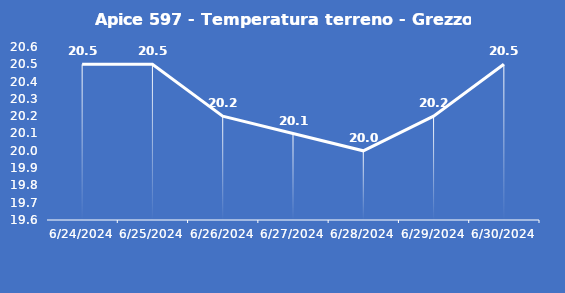
| Category | Apice 597 - Temperatura terreno - Grezzo (°C) |
|---|---|
| 6/24/24 | 20.5 |
| 6/25/24 | 20.5 |
| 6/26/24 | 20.2 |
| 6/27/24 | 20.1 |
| 6/28/24 | 20 |
| 6/29/24 | 20.2 |
| 6/30/24 | 20.5 |